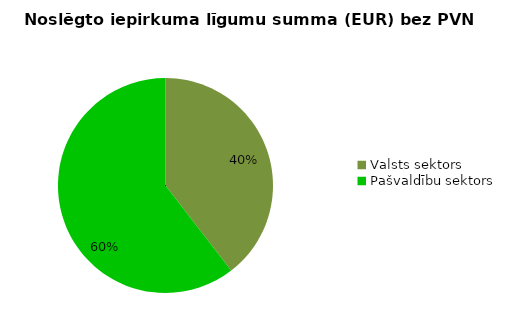
| Category | Noslēgto iepirkuma līgumu summa (EUR) bez PVN |
|---|---|
| Valsts sektors | 14184480 |
| Pašvaldību sektors | 21689954 |